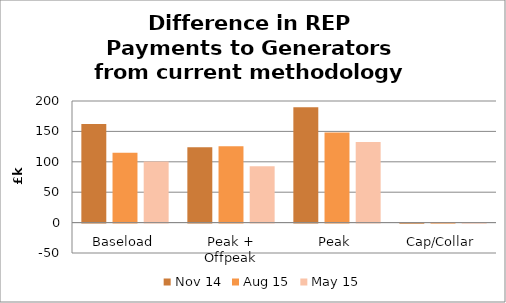
| Category | Nov 14 | Aug 15 | May 15 |
|---|---|---|---|
| Baseload | 162.279 | 114.856 | 100.317 |
| Peak + Offpeak | 123.842 | 125.397 | 92.824 |
| Peak | 189.592 | 148.292 | 132.562 |
| Cap/Collar | -0.173 | 0.764 | 0.015 |